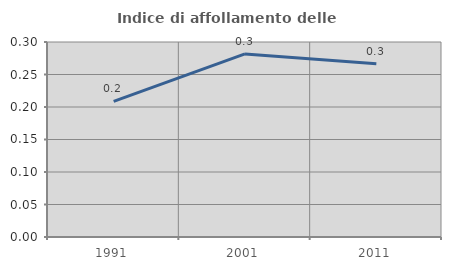
| Category | Indice di affollamento delle abitazioni  |
|---|---|
| 1991.0 | 0.209 |
| 2001.0 | 0.282 |
| 2011.0 | 0.266 |